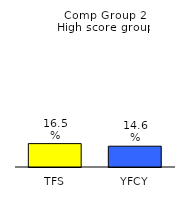
| Category | Series 0 |
|---|---|
| TFS | 0.165 |
| YFCY | 0.146 |